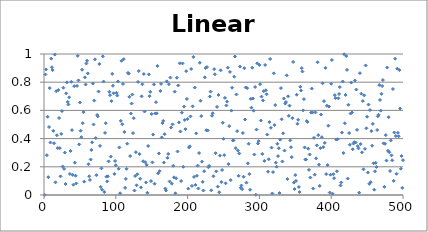
| Category | Linear |
|---|---|
| 0 | 0 |
| 1 | 0.855 |
| 2 | 0.89 |
| 3 | 0.282 |
| 4 | 0.555 |
| 5 | 0.126 |
| 6 | 0.482 |
| 7 | 0.759 |
| 8 | 0.372 |
| 9 | 0.967 |
| 10 | 0.906 |
| 11 | 0.886 |
| 12 | 0.455 |
| 13 | 0.367 |
| 14 | 0.996 |
| 15 | 0.09 |
| 16 | 0.736 |
| 17 | 0.424 |
| 18 | 0.333 |
| 19 | 0.745 |
| 20 | 0.546 |
| 21 | 0.332 |
| 22 | 0.132 |
| 23 | 0.433 |
| 24 | 0.595 |
| 25 | 0.202 |
| 26 | 0.761 |
| 27 | 0.185 |
| 28 | 0.301 |
| 29 | 0.078 |
| 30 | 0.721 |
| 31 | 0.799 |
| 32 | 0.66 |
| 33 | 0.642 |
| 34 | 0.693 |
| 35 | 0.15 |
| 36 | 0.313 |
| 37 | 0.803 |
| 38 | 0.46 |
| 39 | 0.142 |
| 40 | 0.073 |
| 41 | 0.772 |
| 42 | 0.229 |
| 43 | 0.137 |
| 44 | 0.082 |
| 45 | 0.773 |
| 46 | 0.987 |
| 47 | 0.813 |
| 48 | 0.359 |
| 49 | 0.656 |
| 50 | 0.456 |
| 51 | 0.41 |
| 52 | 0.888 |
| 53 | 0.51 |
| 54 | 0.588 |
| 55 | 0.095 |
| 56 | 0.835 |
| 57 | 0.783 |
| 58 | 0.933 |
| 59 | 0.952 |
| 60 | 0.863 |
| 61 | 0.218 |
| 62 | 0.133 |
| 63 | 0.107 |
| 64 | 0.252 |
| 65 | 0.319 |
| 66 | 0.373 |
| 67 | 0.791 |
| 68 | 0.5 |
| 69 | 0.67 |
| 70 | 0.962 |
| 71 | 0.404 |
| 72 | 0.14 |
| 73 | 0.568 |
| 74 | 0.558 |
| 75 | 0.734 |
| 76 | 0.929 |
| 77 | 0.348 |
| 78 | 0.057 |
| 79 | 0.189 |
| 80 | 0.038 |
| 81 | 0.983 |
| 82 | 0.804 |
| 83 | 0.021 |
| 84 | 0.44 |
| 85 | 0.509 |
| 86 | 0.13 |
| 87 | 0.096 |
| 88 | 0.133 |
| 89 | 0.238 |
| 90 | 0.732 |
| 91 | 0.708 |
| 92 | 0.272 |
| 93 | 0.666 |
| 94 | 0.86 |
| 95 | 0.775 |
| 96 | 0.722 |
| 97 | 0.15 |
| 98 | 0.241 |
| 99 | 0.211 |
| 100 | 0.725 |
| 101 | 0.706 |
| 102 | 0.805 |
| 103 | 0.186 |
| 104 | 0.337 |
| 105 | 0.012 |
| 106 | 0.526 |
| 107 | 0.952 |
| 108 | 0.502 |
| 109 | 0.788 |
| 110 | 0.963 |
| 111 | 0.447 |
| 112 | 0.051 |
| 113 | 0.114 |
| 114 | 0.186 |
| 115 | 0.364 |
| 116 | 0.866 |
| 117 | 0.861 |
| 118 | 0.696 |
| 119 | 0.276 |
| 120 | 0.578 |
| 121 | 0.648 |
| 122 | 0.712 |
| 123 | 0.439 |
| 124 | 0.545 |
| 125 | 0.032 |
| 126 | 0.135 |
| 127 | 0.304 |
| 128 | 0.069 |
| 129 | 0.147 |
| 130 | 0.802 |
| 131 | 0.879 |
| 132 | 0.29 |
| 133 | 0.115 |
| 134 | 0.054 |
| 135 | 0.7 |
| 136 | 0.785 |
| 137 | 0.239 |
| 138 | 0.858 |
| 139 | 0.592 |
| 140 | 0.232 |
| 141 | 0.089 |
| 142 | 0.214 |
| 143 | 0.016 |
| 144 | 0.347 |
| 145 | 0.855 |
| 146 | 0.701 |
| 147 | 0.732 |
| 148 | 0.099 |
| 149 | 0.574 |
| 150 | 0.232 |
| 151 | 0.428 |
| 152 | 0.784 |
| 153 | 0.08 |
| 154 | 0.578 |
| 155 | 0.658 |
| 156 | 0.579 |
| 157 | 0.915 |
| 158 | 0.154 |
| 159 | 0.295 |
| 160 | 0.169 |
| 161 | 0.738 |
| 162 | 0.788 |
| 163 | 0.409 |
| 164 | 0.51 |
| 165 | 0.525 |
| 166 | 0.23 |
| 167 | 0.431 |
| 168 | 0.046 |
| 169 | 0.032 |
| 170 | 0.806 |
| 171 | 0.264 |
| 172 | 0.291 |
| 173 | 0.786 |
| 174 | 0.096 |
| 175 | 0.833 |
| 176 | 0.478 |
| 177 | 0.08 |
| 178 | 0.501 |
| 179 | 0.207 |
| 180 | 0.125 |
| 181 | 0.733 |
| 182 | 0.012 |
| 183 | 0.119 |
| 184 | 0.832 |
| 185 | 0.309 |
| 186 | 0.777 |
| 187 | 0.515 |
| 188 | 0.934 |
| 189 | 0.451 |
| 190 | 0.099 |
| 191 | 0.584 |
| 192 | 0.933 |
| 193 | 0.2 |
| 194 | 0.627 |
| 195 | 0.532 |
| 196 | 0.467 |
| 197 | 0.878 |
| 198 | 0.681 |
| 199 | 0.539 |
| 200 | 0.045 |
| 201 | 0.338 |
| 202 | 0.345 |
| 203 | 0.557 |
| 204 | 0.894 |
| 205 | 0.064 |
| 206 | 0.629 |
| 207 | 0.979 |
| 208 | 0.129 |
| 209 | 0.762 |
| 210 | 0.072 |
| 211 | 0.437 |
| 212 | 0.136 |
| 213 | 0.208 |
| 214 | 0.046 |
| 215 | 0.297 |
| 216 | 0.938 |
| 217 | 0.668 |
| 218 | 0.56 |
| 219 | 0.236 |
| 220 | 0.093 |
| 221 | 0.032 |
| 222 | 0.168 |
| 223 | 0.835 |
| 224 | 0.901 |
| 225 | 0.459 |
| 226 | 0.907 |
| 227 | 0.458 |
| 228 | 0.196 |
| 229 | 0.207 |
| 230 | 0.699 |
| 231 | 0.733 |
| 232 | 0.033 |
| 233 | 0.562 |
| 234 | 0.58 |
| 235 | 0.133 |
| 236 | 0.893 |
| 237 | 0.856 |
| 238 | 0.297 |
| 239 | 0.168 |
| 240 | 0.625 |
| 241 | 0.06 |
| 242 | 0.709 |
| 243 | 0.02 |
| 244 | 0.279 |
| 245 | 0.884 |
| 246 | 0.092 |
| 247 | 0.177 |
| 248 | 0.512 |
| 249 | 0.399 |
| 250 | 0.283 |
| 251 | 0.689 |
| 252 | 0.083 |
| 253 | 0.635 |
| 254 | 0.662 |
| 255 | 0.903 |
| 256 | 0.219 |
| 257 | 0.488 |
| 258 | 0.873 |
| 259 | 0.105 |
| 260 | 0.598 |
| 261 | 0.761 |
| 262 | 0.386 |
| 263 | 0.387 |
| 264 | 0.839 |
| 265 | 0.982 |
| 266 | 0.332 |
| 267 | 0.713 |
| 268 | 0.453 |
| 269 | 0.315 |
| 270 | 0.136 |
| 271 | 0.294 |
| 272 | 0.91 |
| 273 | 0.051 |
| 274 | 0.068 |
| 275 | 0.041 |
| 276 | 0.44 |
| 277 | 0.13 |
| 278 | 0.899 |
| 279 | 0.535 |
| 280 | 0.763 |
| 281 | 0.087 |
| 282 | 0.758 |
| 283 | 0.225 |
| 284 | 0.364 |
| 285 | 0.148 |
| 286 | 0.037 |
| 287 | 0.682 |
| 288 | 0.62 |
| 289 | 0.903 |
| 290 | 0.684 |
| 291 | 0.598 |
| 292 | 0.287 |
| 293 | 0.766 |
| 294 | 0.001 |
| 295 | 0.464 |
| 296 | 0.934 |
| 297 | 0.365 |
| 298 | 0.382 |
| 299 | 0.922 |
| 300 | 0.786 |
| 301 | 0.528 |
| 302 | 0.698 |
| 303 | 0.291 |
| 304 | 0.671 |
| 305 | 0.736 |
| 306 | 0.242 |
| 307 | 0.922 |
| 308 | 0.743 |
| 309 | 0.715 |
| 310 | 0.429 |
| 311 | 0.165 |
| 312 | 0.253 |
| 313 | 0.517 |
| 314 | 0.965 |
| 315 | 0.477 |
| 316 | 0.336 |
| 317 | 0.011 |
| 318 | 0.162 |
| 319 | 0.863 |
| 320 | 0.496 |
| 321 | 0.638 |
| 322 | 0.229 |
| 323 | 0.201 |
| 324 | 0.363 |
| 325 | 0.276 |
| 326 | 0.332 |
| 327 | 0.014 |
| 328 | 0.393 |
| 329 | 0.758 |
| 330 | 0.537 |
| 331 | 0.238 |
| 332 | 0.437 |
| 333 | 0.684 |
| 334 | 0.315 |
| 335 | 0.648 |
| 336 | 0.66 |
| 337 | 0.849 |
| 338 | 0.113 |
| 339 | 0.7 |
| 340 | 0.561 |
| 341 | 0.634 |
| 342 | 0.387 |
| 343 | 0.339 |
| 344 | 0.268 |
| 345 | 0.545 |
| 346 | 0.944 |
| 347 | 0.088 |
| 348 | 0.042 |
| 349 | 0.141 |
| 350 | 0.1 |
| 351 | 0.711 |
| 352 | 0.505 |
| 353 | 0.533 |
| 354 | 0.057 |
| 355 | 0.021 |
| 356 | 0.767 |
| 357 | 0.741 |
| 358 | 0.9 |
| 359 | 0.876 |
| 360 | 0.6 |
| 361 | 0.68 |
| 362 | 0.337 |
| 363 | 0.251 |
| 364 | 0.252 |
| 365 | 0.524 |
| 366 | 0.518 |
| 367 | 0.329 |
| 368 | 0.178 |
| 369 | 0.287 |
| 370 | 0.124 |
| 371 | 0.585 |
| 372 | 0.755 |
| 373 | 0.585 |
| 374 | 0.046 |
| 375 | 0.406 |
| 376 | 0.144 |
| 377 | 0.586 |
| 378 | 0.26 |
| 379 | 0.352 |
| 380 | 0.942 |
| 381 | 0.424 |
| 382 | 0.215 |
| 383 | 0.065 |
| 384 | 0.332 |
| 385 | 0.571 |
| 386 | 0.41 |
| 387 | 0.792 |
| 388 | 0.339 |
| 389 | 0.665 |
| 390 | 0.369 |
| 391 | 0.902 |
| 392 | 0.148 |
| 393 | 0.633 |
| 394 | 0.212 |
| 395 | 0.492 |
| 396 | 0.627 |
| 397 | 0.018 |
| 398 | 0.144 |
| 399 | 0.789 |
| 400 | 0.957 |
| 401 | 0.009 |
| 402 | 0.147 |
| 403 | 0.119 |
| 404 | 0.708 |
| 405 | 0.687 |
| 406 | 0.393 |
| 407 | 0.169 |
| 408 | 0.396 |
| 409 | 0.686 |
| 410 | 0.716 |
| 411 | 0.765 |
| 412 | 0.068 |
| 413 | 0.089 |
| 414 | 0.443 |
| 415 | 0.805 |
| 416 | 0.298 |
| 417 | 0.998 |
| 418 | 0.509 |
| 419 | 0.709 |
| 420 | 0.985 |
| 421 | 0.887 |
| 422 | 0.116 |
| 423 | 0.64 |
| 424 | 0.439 |
| 425 | 0.356 |
| 426 | 0.578 |
| 427 | 0.797 |
| 428 | 0.585 |
| 429 | 0.324 |
| 430 | 0.365 |
| 431 | 0.375 |
| 432 | 0.812 |
| 433 | 0.372 |
| 434 | 0.748 |
| 435 | 0.462 |
| 436 | 0.347 |
| 437 | 0.33 |
| 438 | 0.017 |
| 439 | 0.864 |
| 440 | 0.361 |
| 441 | 0.719 |
| 442 | 0.303 |
| 443 | 0.667 |
| 444 | 0.182 |
| 445 | 0.707 |
| 446 | 0.327 |
| 447 | 0.919 |
| 448 | 0.473 |
| 449 | 0.555 |
| 450 | 0.159 |
| 451 | 0.641 |
| 452 | 0.079 |
| 453 | 0.602 |
| 454 | 0.091 |
| 455 | 0.453 |
| 456 | 0.349 |
| 457 | 0.504 |
| 458 | 0.225 |
| 459 | 0.037 |
| 460 | 0.168 |
| 461 | 0.228 |
| 462 | 0.199 |
| 463 | 0.461 |
| 464 | 0.558 |
| 465 | 0.569 |
| 466 | 0.78 |
| 467 | 0.674 |
| 468 | 0.598 |
| 469 | 0.717 |
| 470 | 0.773 |
| 471 | 0.815 |
| 472 | 0.366 |
| 473 | 0.058 |
| 474 | 0.363 |
| 475 | 0.425 |
| 476 | 0.244 |
| 477 | 0.904 |
| 478 | 0.313 |
| 479 | 0.552 |
| 480 | 0.303 |
| 481 | 0.17 |
| 482 | 0.387 |
| 483 | 0.281 |
| 484 | 0.246 |
| 485 | 0.751 |
| 486 | 0.1 |
| 487 | 0.443 |
| 488 | 0.966 |
| 489 | 0.418 |
| 490 | 0.15 |
| 491 | 0.896 |
| 492 | 0.441 |
| 493 | 0.416 |
| 494 | 0.886 |
| 495 | 0.613 |
| 496 | 0.186 |
| 497 | 0.277 |
| 498 | 0.05 |
| 499 | 0.247 |